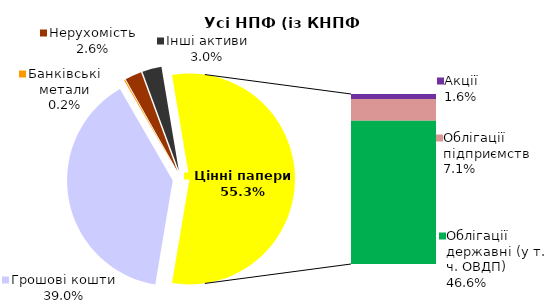
| Category | Усі НПФ (із КНПФ НБУ)* |
|---|---|
| Грошові кошти | 1160.3 |
| Банківські метали | 5 |
| Нерухомість | 76 |
| Інші активи | 88.1 |
| Акції | 47.4 |
| Облігації підприємств | 210.2 |
| Муніципальні облігації | 0 |
| Облігації державні (у т. ч. ОВДП) | 1385.7 |